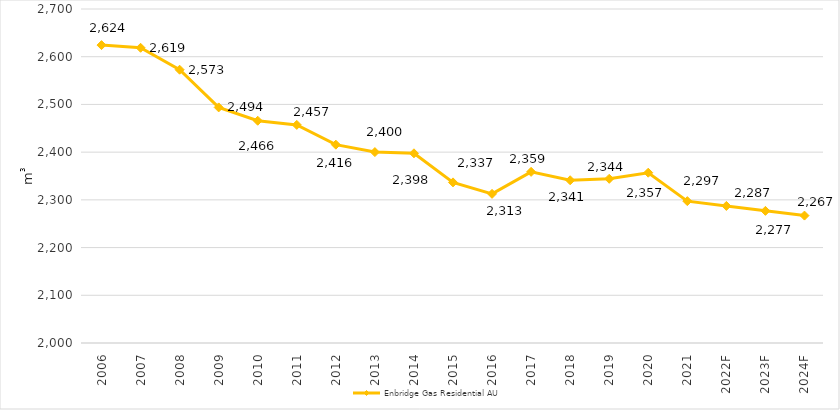
| Category | Enbridge Gas Residential AU |
|---|---|
| 2006 | 2624.337 |
| 2007 | 2618.705 |
| 2008 | 2572.749 |
| 2009 | 2493.738 |
| 2010 | 2465.797 |
| 2011 | 2457.089 |
| 2012 | 2415.661 |
| 2013 | 2400.107 |
| 2014 | 2397.565 |
| 2015 | 2336.631 |
| 2016 | 2312.585 |
| 2017 | 2358.693 |
| 2018 | 2341.086 |
| 2019 | 2344.106 |
| 2020 | 2356.899 |
| 2021 | 2297.32 |
| 2022F | 2287.272 |
| 2023F | 2276.94 |
| 2024F | 2267.028 |